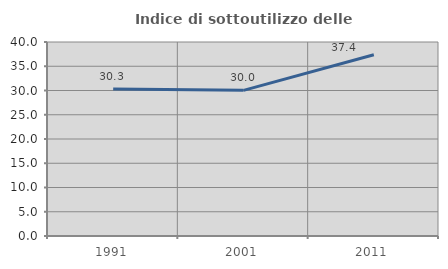
| Category | Indice di sottoutilizzo delle abitazioni  |
|---|---|
| 1991.0 | 30.303 |
| 2001.0 | 30.028 |
| 2011.0 | 37.366 |